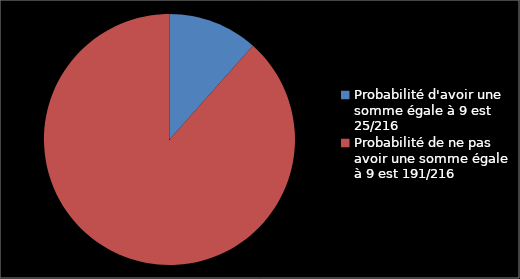
| Category | Series 0 |
|---|---|
| Probabilité d'avoir une somme égale à 9 est 25/216  | 0.116 |
| Probabilité de ne pas avoir une somme égale à 9 est 191/216 | 0.884 |